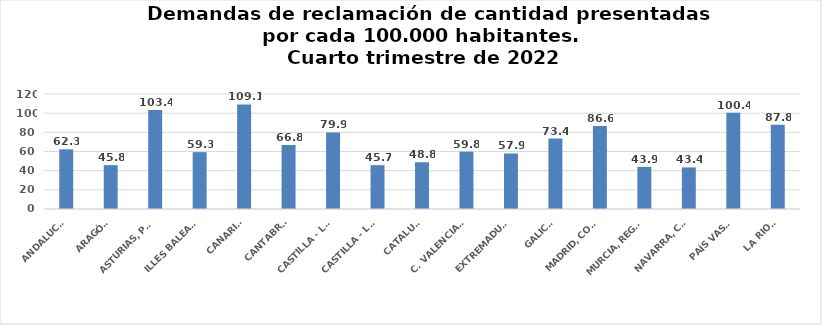
| Category | Series 0 |
|---|---|
| ANDALUCÍA | 62.26 |
| ARAGÓN | 45.766 |
| ASTURIAS, PRINCIPADO | 103.415 |
| ILLES BALEARS | 59.32 |
| CANARIAS | 109.106 |
| CANTABRIA | 66.792 |
| CASTILLA - LEÓN | 79.869 |
| CASTILLA - LA MANCHA | 45.731 |
| CATALUÑA | 48.815 |
| C. VALENCIANA | 59.808 |
| EXTREMADURA | 57.927 |
| GALICIA | 73.445 |
| MADRID, COMUNIDAD | 86.573 |
| MURCIA, REGIÓN | 43.933 |
| NAVARRA, COM. FORAL | 43.366 |
| PAÍS VASCO | 100.354 |
| LA RIOJA | 87.842 |